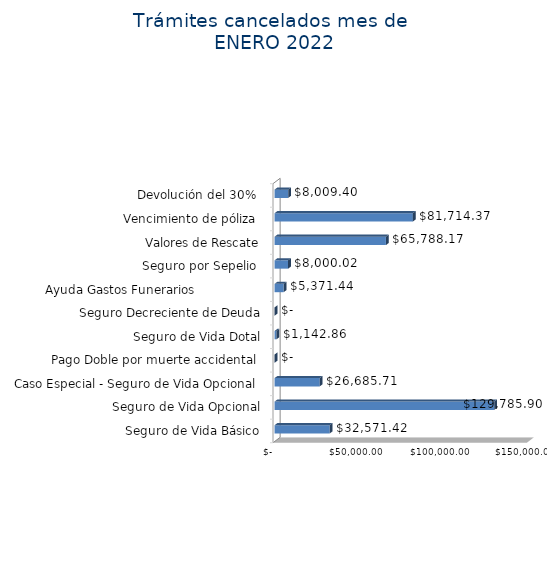
| Category | Monto  |
|---|---|
| Seguro de Vida Básico | 32571.42 |
| Seguro de Vida Opcional | 129785.9 |
| Caso Especial - Seguro de Vida Opcional  | 26685.71 |
| Pago Doble por muerte accidental  | 0 |
| Seguro de Vida Dotal | 1142.86 |
| Seguro Decreciente de Deuda | 0 |
| Ayuda Gastos Funerarios                  | 5371.44 |
| Seguro por Sepelio  | 8000.02 |
| Valores de Rescate | 65788.17 |
| Vencimiento de póliza  | 81714.37 |
| Devolución del 30%  | 8009.4 |